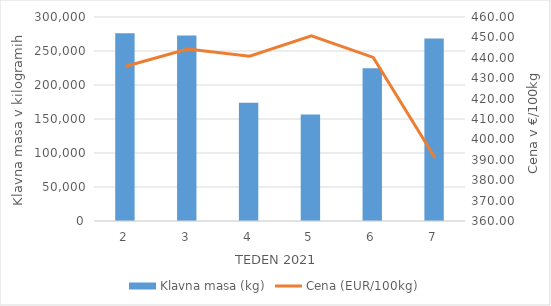
| Category | Klavna masa (kg) |
|---|---|
| 2.0 | 275951 |
| 3.0 | 272797 |
| 4.0 | 174056 |
| 5.0 | 156508 |
| 6.0 | 224595 |
| 7.0 | 268436 |